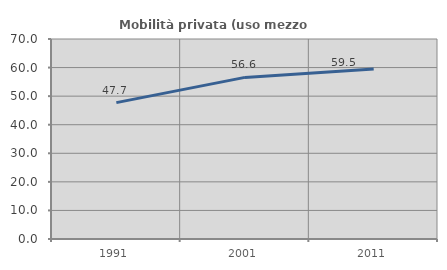
| Category | Mobilità privata (uso mezzo privato) |
|---|---|
| 1991.0 | 47.722 |
| 2001.0 | 56.559 |
| 2011.0 | 59.482 |